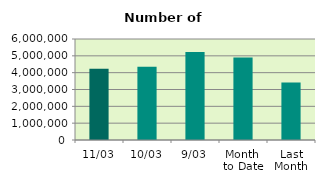
| Category | Series 0 |
|---|---|
| 11/03 | 4238976 |
| 10/03 | 4349292 |
| 9/03 | 5228984 |
| Month 
to Date | 4898450.667 |
| Last
Month | 3413232.3 |